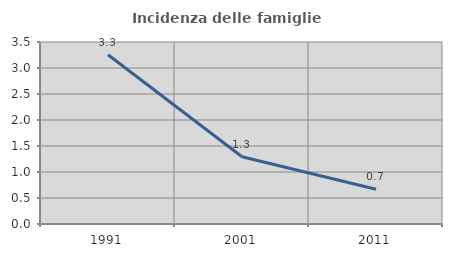
| Category | Incidenza delle famiglie numerose |
|---|---|
| 1991.0 | 3.256 |
| 2001.0 | 1.294 |
| 2011.0 | 0.669 |